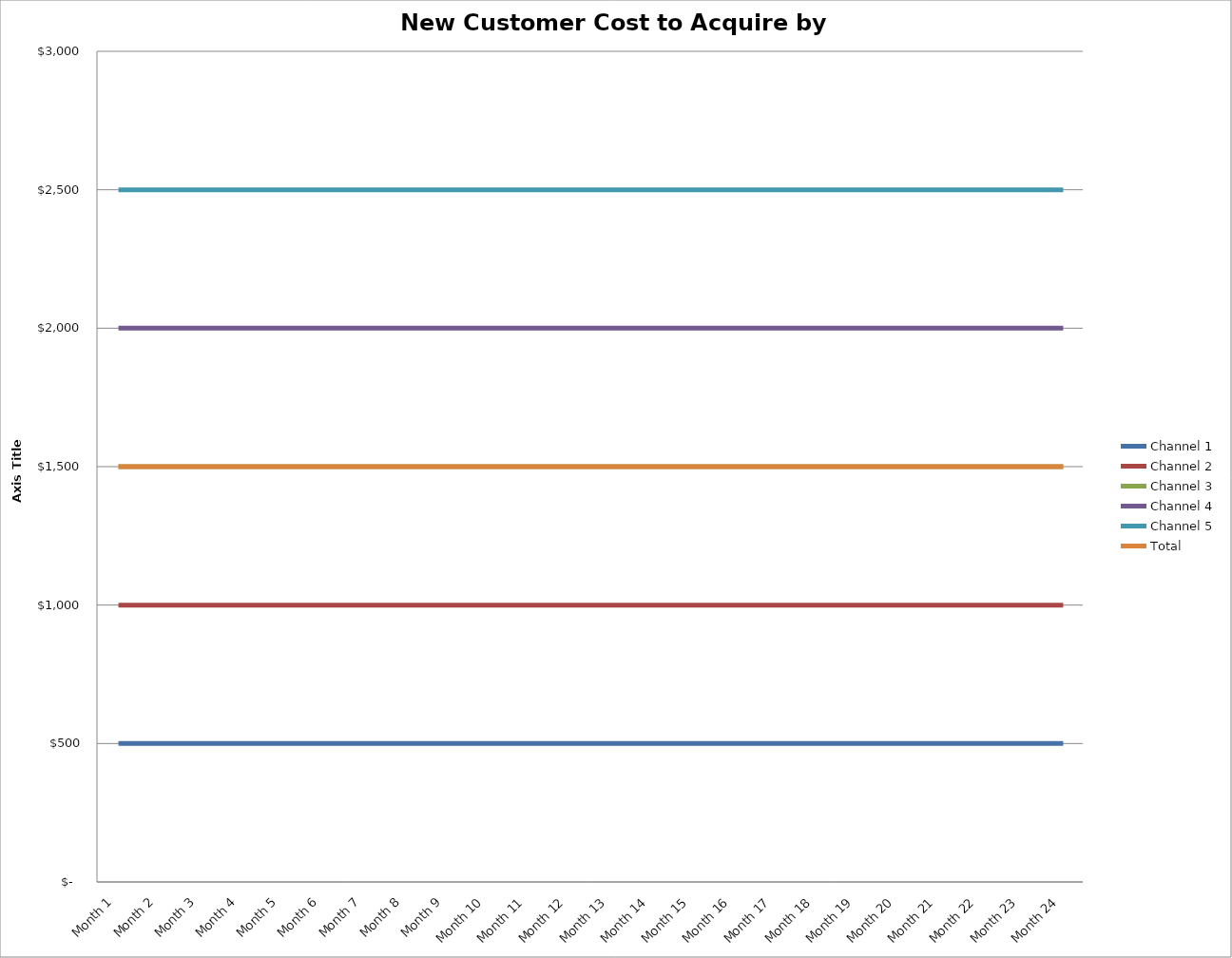
| Category | Channel 1 | Channel 2 | Channel 3 | Channel 4 | Channel 5 | Total |
|---|---|---|---|---|---|---|
| Month 1 | 500 | 1000 | 1500 | 2000 | 2500 | 1500 |
| Month 2 | 500 | 1000 | 1500 | 2000 | 2500 | 1500 |
| Month 3 | 500 | 1000 | 1500 | 2000 | 2500 | 1500 |
| Month 4 | 500 | 1000 | 1500 | 2000 | 2500 | 1500 |
| Month 5 | 500 | 1000 | 1500 | 2000 | 2500 | 1500 |
| Month 6 | 500 | 1000 | 1500 | 2000 | 2500 | 1500 |
| Month 7 | 500 | 1000 | 1500 | 2000 | 2500 | 1500 |
| Month 8 | 500 | 1000 | 1500 | 2000 | 2500 | 1500 |
| Month 9 | 500 | 1000 | 1500 | 2000 | 2500 | 1500 |
| Month 10 | 500 | 1000 | 1500 | 2000 | 2500 | 1500 |
| Month 11 | 500 | 1000 | 1500 | 2000 | 2500 | 1500 |
| Month 12 | 500 | 1000 | 1500 | 2000 | 2500 | 1500 |
| Month 13 | 500 | 1000 | 1500 | 2000 | 2500 | 1500 |
| Month 14 | 500 | 1000 | 1500 | 2000 | 2500 | 1500 |
| Month 15 | 500 | 1000 | 1500 | 2000 | 2500 | 1500 |
| Month 16 | 500 | 1000 | 1500 | 2000 | 2500 | 1500 |
| Month 17 | 500 | 1000 | 1500 | 2000 | 2500 | 1500 |
| Month 18 | 500 | 1000 | 1500 | 2000 | 2500 | 1500 |
| Month 19 | 500 | 1000 | 1500 | 2000 | 2500 | 1500 |
| Month 20 | 500 | 1000 | 1500 | 2000 | 2500 | 1500 |
| Month 21 | 500 | 1000 | 1500 | 2000 | 2500 | 1500 |
| Month 22 | 500 | 1000 | 1500 | 2000 | 2500 | 1500 |
| Month 23 | 500 | 1000 | 1500 | 2000 | 2500 | 1500 |
| Month 24 | 500 | 1000 | 1500 | 2000 | 2500 | 1500 |